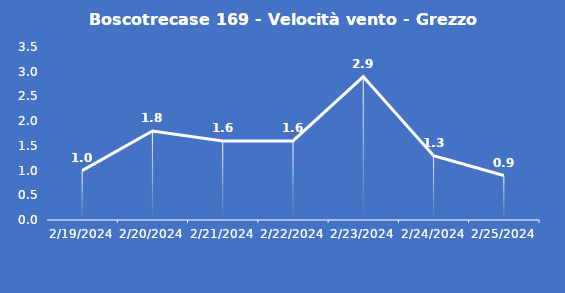
| Category | Boscotrecase 169 - Velocità vento - Grezzo (m/s) |
|---|---|
| 2/19/24 | 1 |
| 2/20/24 | 1.8 |
| 2/21/24 | 1.6 |
| 2/22/24 | 1.6 |
| 2/23/24 | 2.9 |
| 2/24/24 | 1.3 |
| 2/25/24 | 0.9 |